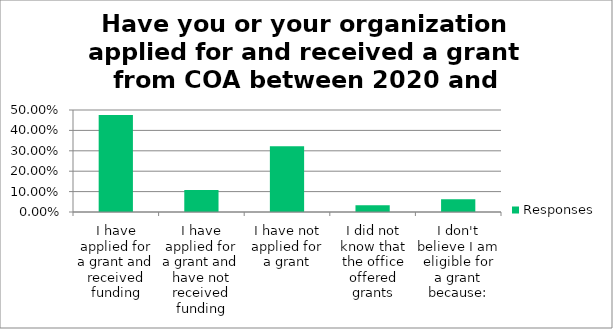
| Category | Responses |
|---|---|
| I have applied for a grant and received funding | 0.476 |
| I have applied for a grant and have not received funding | 0.108 |
| I have not applied for a grant | 0.322 |
| I did not know that the office offered grants | 0.033 |
| I don't believe I am eligible for a grant because: | 0.062 |